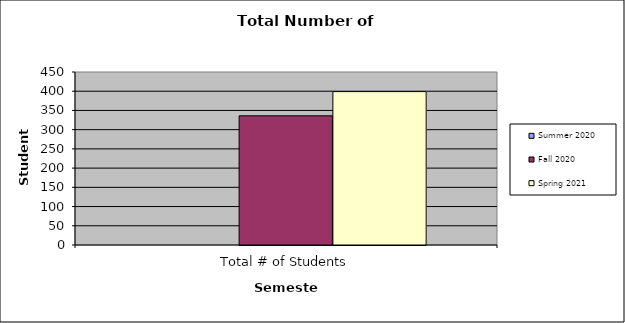
| Category | Summer 2020 | Fall 2020 | Spring 2021 |
|---|---|---|---|
| Total # of Students | 0 | 336 | 399 |